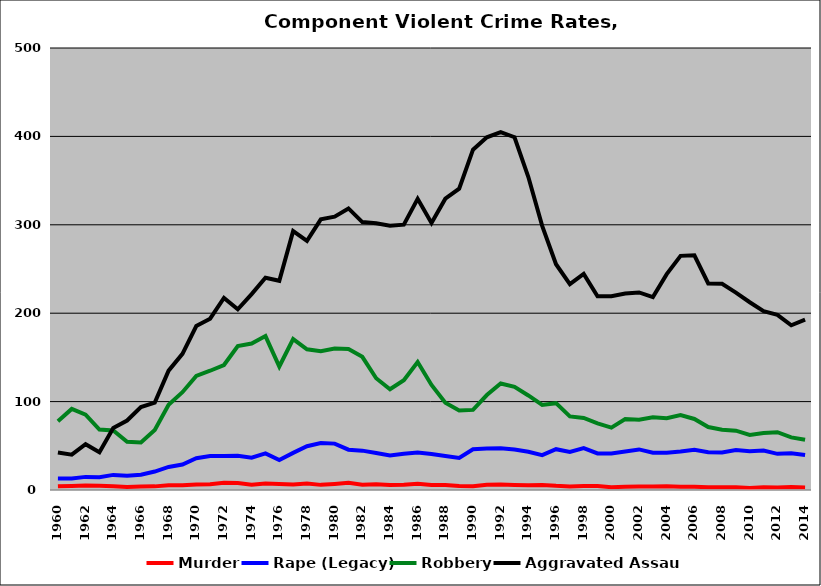
| Category | Murder | Rape (Legacy) | Robbery | Aggravated Assault |
|---|---|---|---|---|
| 1960.0 | 4.162 | 13.056 | 77.653 | 42.419 |
| 1961.0 | 4.66 | 12.914 | 91.69 | 40.034 |
| 1962.0 | 5.034 | 14.84 | 85.16 | 51.757 |
| 1963.0 | 4.793 | 14.533 | 68.332 | 42.631 |
| 1964.0 | 4.171 | 17.091 | 67.294 | 70.092 |
| 1965.0 | 3.504 | 16.15 | 54.495 | 78.568 |
| 1966.0 | 3.996 | 17.35 | 53.819 | 93.778 |
| 1967.0 | 4.101 | 20.861 | 67.949 | 98.937 |
| 1968.0 | 5.371 | 26.123 | 96.533 | 135.01 |
| 1969.0 | 5.333 | 28.81 | 110.667 | 154 |
| 1970.0 | 6.207 | 36.018 | 129.074 | 185.434 |
| 1971.0 | 6.527 | 38.414 | 134.91 | 193.78 |
| 1972.0 | 8.316 | 38.396 | 141.366 | 217.31 |
| 1973.0 | 7.92 | 38.736 | 162.905 | 204.391 |
| 1974.0 | 6.05 | 36.458 | 165.745 | 221.554 |
| 1975.0 | 7.419 | 41.476 | 174.112 | 240.095 |
| 1976.0 | 6.814 | 33.798 | 139.683 | 236.663 |
| 1977.0 | 6.338 | 42.001 | 170.714 | 292.86 |
| 1978.0 | 7.341 | 49.551 | 159.213 | 281.873 |
| 1979.0 | 5.808 | 53.102 | 157.035 | 306.133 |
| 1980.0 | 6.879 | 52.46 | 160.089 | 309.164 |
| 1981.0 | 8.066 | 45.629 | 159.501 | 318.529 |
| 1982.0 | 5.977 | 44.532 | 150.64 | 303.087 |
| 1983.0 | 6.435 | 41.924 | 126.41 | 301.657 |
| 1984.0 | 5.79 | 38.955 | 114.003 | 299.025 |
| 1985.0 | 5.85 | 40.885 | 124.172 | 300.124 |
| 1986.0 | 7.04 | 42.302 | 144.812 | 329.415 |
| 1987.0 | 5.795 | 40.777 | 118.811 | 302.124 |
| 1988.0 | 5.684 | 38.571 | 98.784 | 329.544 |
| 1989.0 | 4.402 | 36.238 | 89.961 | 340.79 |
| 1990.0 | 4.189 | 46.169 | 90.608 | 385.018 |
| 1991.0 | 5.893 | 47.024 | 107.433 | 398.934 |
| 1992.0 | 6.225 | 47.291 | 120.461 | 404.87 |
| 1993.0 | 5.777 | 45.794 | 116.657 | 399.047 |
| 1994.0 | 5.443 | 43.189 | 106.947 | 354.048 |
| 1995.0 | 5.765 | 39.498 | 96.184 | 298.746 |
| 1996.0 | 4.708 | 46.168 | 98.221 | 255.375 |
| 1997.0 | 4.033 | 43.077 | 83.278 | 232.802 |
| 1998.0 | 4.608 | 47.419 | 81.541 | 244.372 |
| 1999.0 | 4.561 | 41.394 | 75.343 | 219.199 |
| 2000.0 | 3.115 | 41.244 | 70.537 | 219.122 |
| 2001.0 | 3.566 | 43.557 | 80.23 | 222.275 |
| 2002.0 | 3.977 | 45.9 | 79.515 | 223.459 |
| 2003.0 | 4.068 | 42.066 | 82.197 | 218.157 |
| 2004.0 | 4.368 | 42.266 | 81.25 | 244.164 |
| 2005.0 | 3.71 | 43.446 | 84.661 | 264.856 |
| 2006.0 | 3.597 | 45.42 | 80.364 | 265.432 |
| 2007.0 | 3.188 | 42.6 | 71.192 | 233.59 |
| 2008.0 | 3.161 | 42.43 | 68.265 | 233.222 |
| 2009.0 | 3.164 | 45.156 | 67.088 | 223.354 |
| 2010.0 | 2.386 | 43.705 | 62.276 | 212.42 |
| 2011.0 | 3.03 | 44.661 | 64.48 | 202.216 |
| 2012.0 | 2.929 | 40.891 | 65.363 | 198.19 |
| 2013.0 | 3.3 | 41.691 | 59.483 | 186.378 |
| 2014.0 | 2.819 | 39.601 | 56.742 | 192.779 |